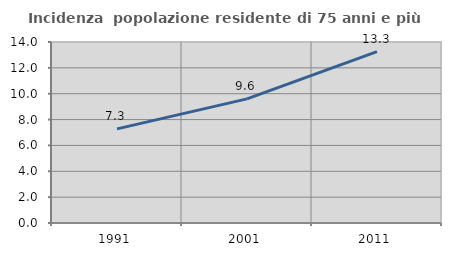
| Category | Incidenza  popolazione residente di 75 anni e più |
|---|---|
| 1991.0 | 7.281 |
| 2001.0 | 9.602 |
| 2011.0 | 13.256 |